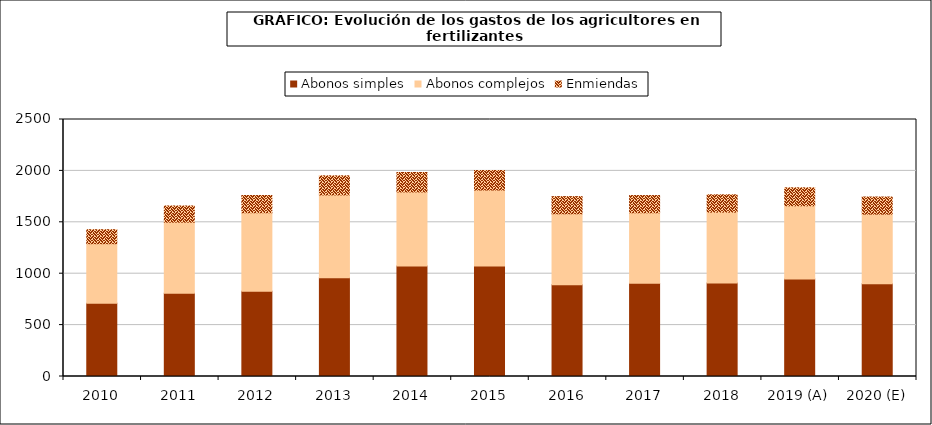
| Category | Abonos simples | Abonos complejos | Enmiendas |
|---|---|---|---|
| 2010 | 711.864 | 580.242 | 135.989 |
| 2011 | 809.32 | 692.087 | 157.487 |
| 2012 | 828.171 | 764.88 | 167.637 |
| 2013 | 959.679 | 806.665 | 185.766 |
| 2014 | 1074.953 | 720.53 | 188.831 |
| 2015 | 1074.955 | 739.068 | 190.781 |
| 2016 | 891.426 | 691.817 | 166.51 |
| 2017 | 906.183 | 686.53 | 167.506 |
| 2018 | 908.668 | 690.56 | 168.191 |
| 2019 (A) | 947.267 | 713.522 | 174.665 |
| 2020 (E) | 901.023 | 678.689 | 166.138 |